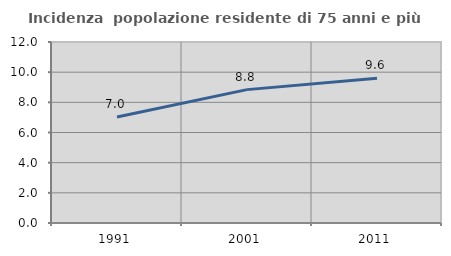
| Category | Incidenza  popolazione residente di 75 anni e più |
|---|---|
| 1991.0 | 7.029 |
| 2001.0 | 8.843 |
| 2011.0 | 9.592 |